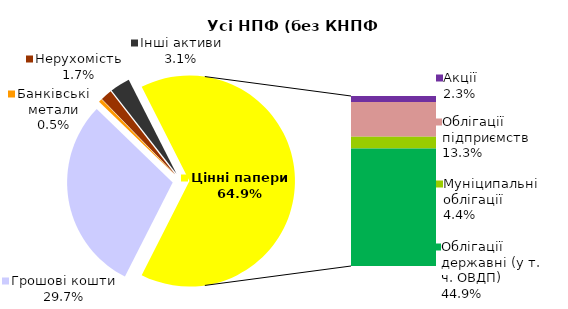
| Category | Усі НПФ (без КНПФ НБУ) |
|---|---|
| Грошові кошти | 614.713 |
| Банківські метали | 10.719 |
| Нерухомість | 35.947 |
| Інші активи | 63.093 |
| Акції | 46.81 |
| Облігації підприємств | 275.263 |
| Муніципальні облігації | 91.659 |
| Облігації державні (у т. ч. ОВДП) | 928.549 |